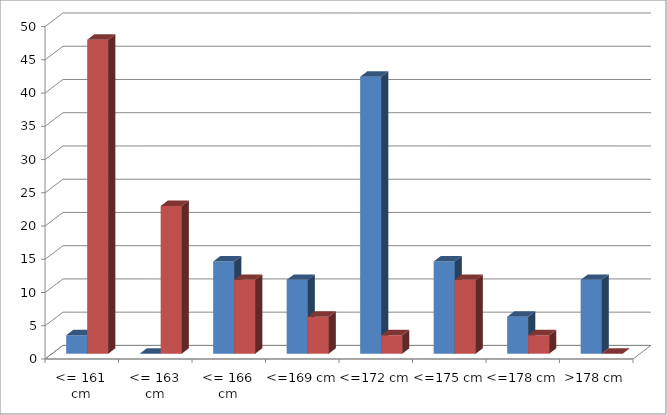
| Category | Series 0 | Series 1 |
|---|---|---|
| <= 161 cm | 2.778 | 47.222 |
| <= 163 cm | 0 | 22.222 |
| <= 166 cm | 13.889 | 11.111 |
| <=169 cm | 11.111 | 5.556 |
| <=172 cm | 41.667 | 2.778 |
| <=175 cm | 13.889 | 11.111 |
| <=178 cm | 5.556 | 2.778 |
| >178 cm | 11.111 | 0 |